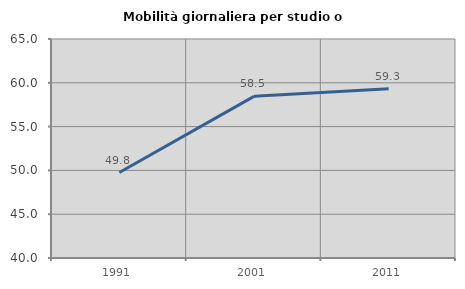
| Category | Mobilità giornaliera per studio o lavoro |
|---|---|
| 1991.0 | 49.755 |
| 2001.0 | 58.456 |
| 2011.0 | 59.317 |